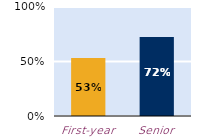
| Category | frequently |
|---|---|
| First-year | 0.532 |
| Senior | 0.725 |